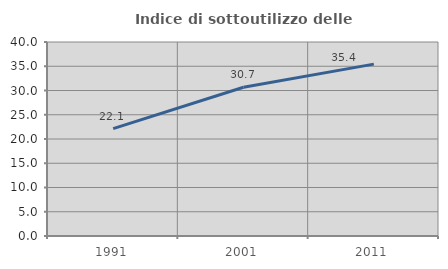
| Category | Indice di sottoutilizzo delle abitazioni  |
|---|---|
| 1991.0 | 22.145 |
| 2001.0 | 30.663 |
| 2011.0 | 35.436 |